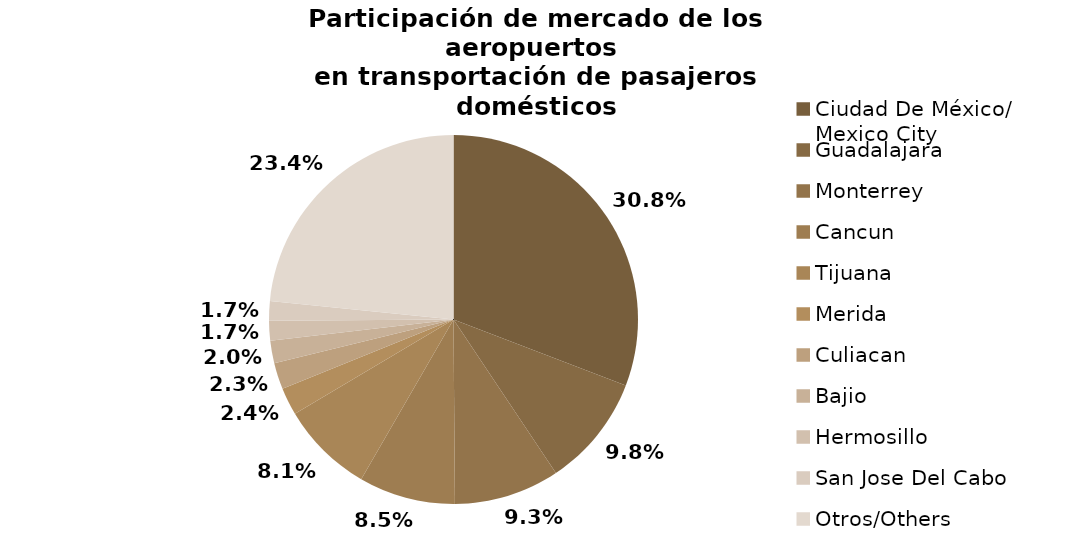
| Category | Series 0 |
|---|---|
| Ciudad De México/
Mexico City | 2888.679 |
| Guadalajara | 920.146 |
| Monterrey | 866.221 |
| Cancun | 792.854 |
| Tijuana | 760.986 |
| Merida | 226.763 |
| Culiacan | 217.242 |
| Bajio | 184.79 |
| Hermosillo | 162.019 |
| San Jose Del Cabo | 160.204 |
| Otros/Others | 2193.169 |